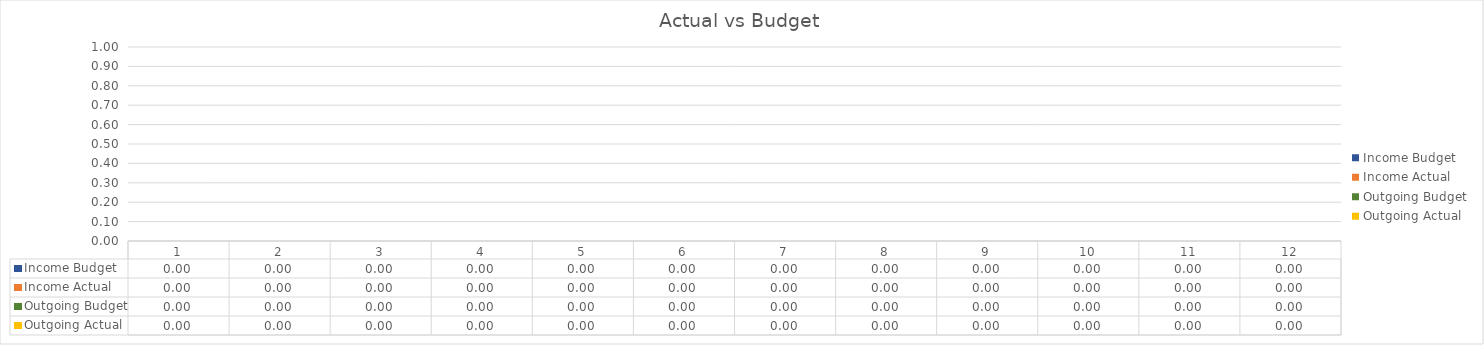
| Category | Income Budget | Income Actual | Outgoing Budget | Outgoing Actual |
|---|---|---|---|---|
| 0 | 0 | 0 | 0 | 0 |
| 1 | 0 | 0 | 0 | 0 |
| 2 | 0 | 0 | 0 | 0 |
| 3 | 0 | 0 | 0 | 0 |
| 4 | 0 | 0 | 0 | 0 |
| 5 | 0 | 0 | 0 | 0 |
| 6 | 0 | 0 | 0 | 0 |
| 7 | 0 | 0 | 0 | 0 |
| 8 | 0 | 0 | 0 | 0 |
| 9 | 0 | 0 | 0 | 0 |
| 10 | 0 | 0 | 0 | 0 |
| 11 | 0 | 0 | 0 | 0 |